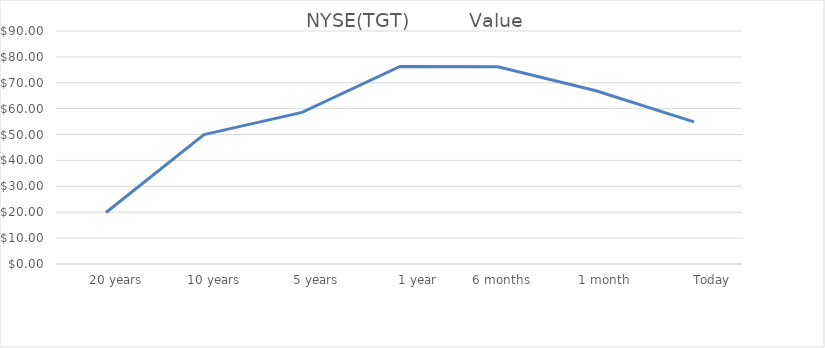
| Category |  NYSE(TGT) |
|---|---|
|       20 years | 19.88 |
|       10 years | 50 |
|         5 years | 58.57 |
|           1 year | 76.3 |
|    6 months | 76.22 |
|      1 month | 66.91 |
|           Today | 54.92 |